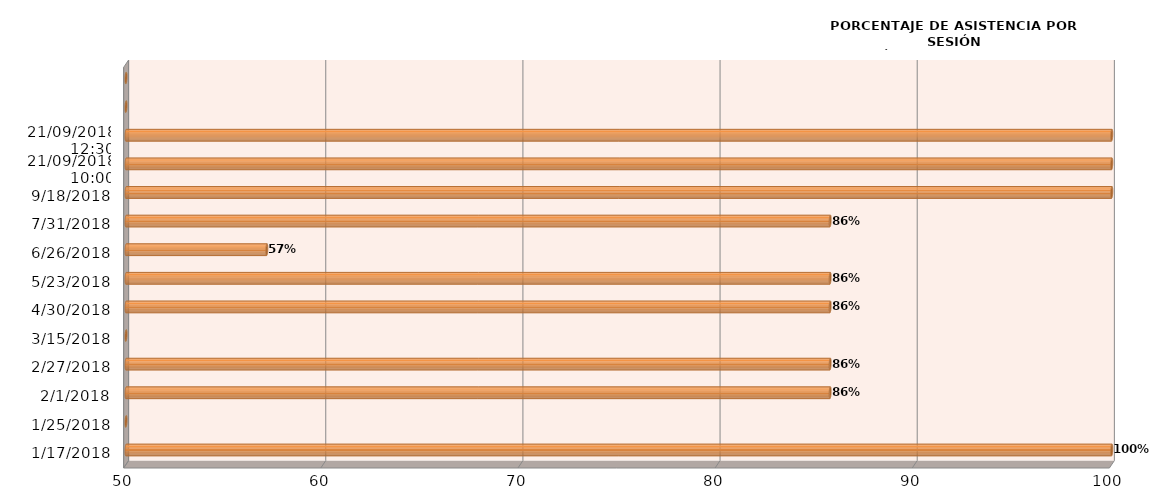
| Category | Series 0 |
|---|---|
| 17/01/2018 | 100 |
| 25/01/2018 | 0 |
| 01/02/2018 | 85.714 |
| 27/02/2018 | 85.714 |
| 15/03/2018 | 0 |
| 30/04/2018 | 85.714 |
| 23/05/2018 | 85.714 |
| 26/06/2018 | 57.143 |
| 31/07/2018 | 85.714 |
| 18/09/2018 | 100 |
| 21/09/2018
10:00 | 100 |
| 21/09/2018
12:30 | 100 |